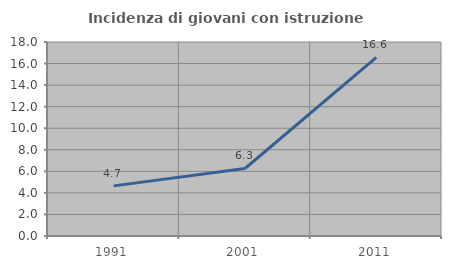
| Category | Incidenza di giovani con istruzione universitaria |
|---|---|
| 1991.0 | 4.651 |
| 2001.0 | 6.263 |
| 2011.0 | 16.578 |